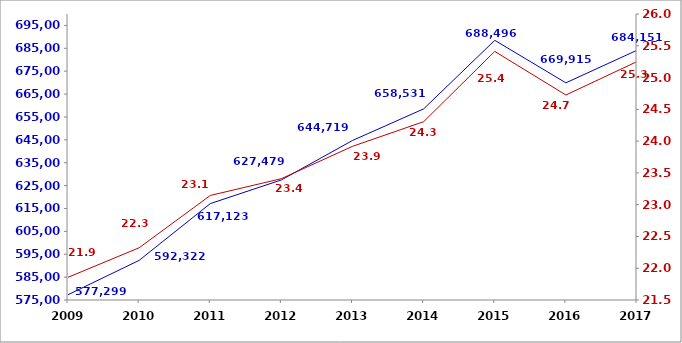
| Category | Series 0 |
|---|---|
| 2009.0 | 577299 |
| 2010.0 | 592322 |
| 2011.0 | 617123 |
| 2012.0 | 627479 |
| 2013.0 | 644719 |
| 2014.0 | 658531 |
| 2015.0 | 688496 |
| 2016.0 | 669915 |
| 2017.0 | 684151 |